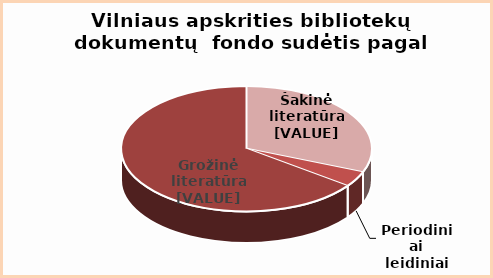
| Category | Series 0 |
|---|---|
| Šakinė literatūra | 31.1 |
| Periodiniai leidiniai | 4 |
| Grožinė literatūra | 64.9 |